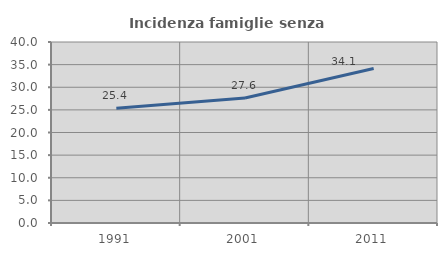
| Category | Incidenza famiglie senza nuclei |
|---|---|
| 1991.0 | 25.367 |
| 2001.0 | 27.623 |
| 2011.0 | 34.134 |